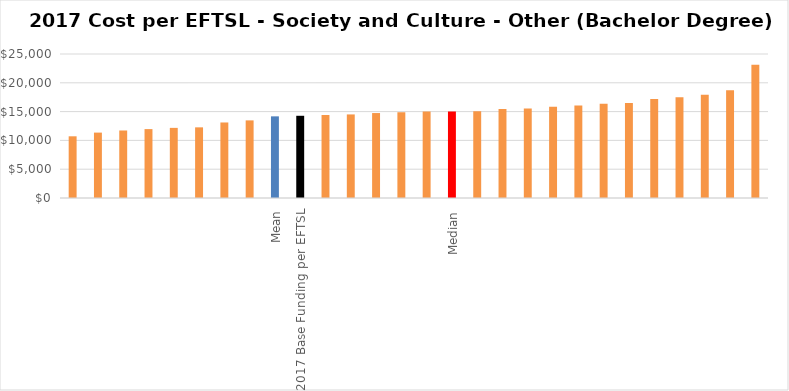
| Category | Series 0 |
|---|---|
|  | 10711.654 |
|  | 11353.002 |
|  | 11720.24 |
|  | 11962.208 |
|  | 12175.034 |
|  | 12265.973 |
|  | 13112.7 |
|  | 13475.017 |
| Mean | 14175.359 |
| 2017 Base Funding per EFTSL | 14274.016 |
|  | 14406.813 |
|  | 14509.738 |
|  | 14748.283 |
|  | 14875.203 |
|  | 15021.441 |
| Median | 15021.441 |